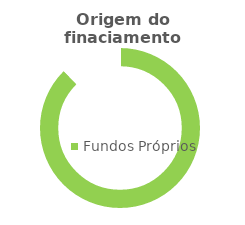
| Category | Series 0 |
|---|---|
| Fundos Próprios | 0.878 |
| Restante | 0.122 |